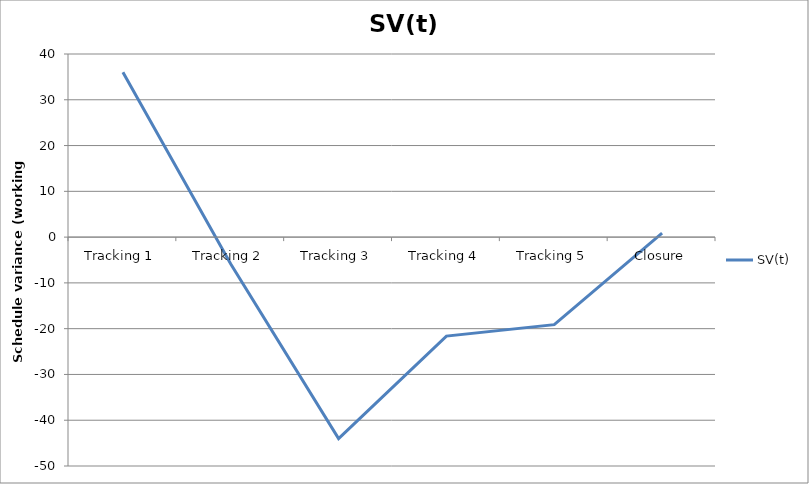
| Category | SV(t) |
|---|---|
| Tracking 1 | 36 |
| Tracking 2 | -5.875 |
| Tracking 3 | -44 |
| Tracking 4 | -21.625 |
| Tracking 5 | -19.125 |
| Closure | 0.875 |